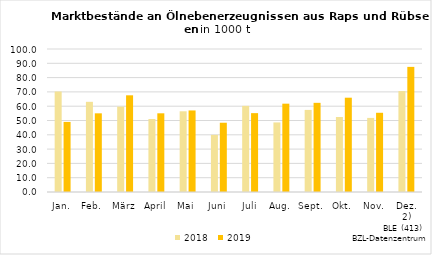
| Category | 2018 | 2019 |
|---|---|---|
| Jan. | 70.279 | 49.004 |
| Feb. | 63.062 | 55.017 |
| März | 59.708 | 67.615 |
| April | 51.063 | 55.032 |
| Mai | 56.441 | 57.029 |
| Juni | 39.945 | 48.442 |
| Juli | 60.234 | 55.151 |
| Aug. | 48.648 | 61.766 |
| Sept. | 57.406 | 62.354 |
| Okt. | 52.454 | 65.943 |
| Nov. | 51.814 | 55.4 |
| Dez. 2) | 70.591 | 87.5 |